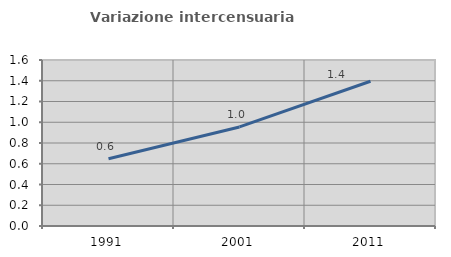
| Category | Variazione intercensuaria annua |
|---|---|
| 1991.0 | 0.648 |
| 2001.0 | 0.955 |
| 2011.0 | 1.395 |